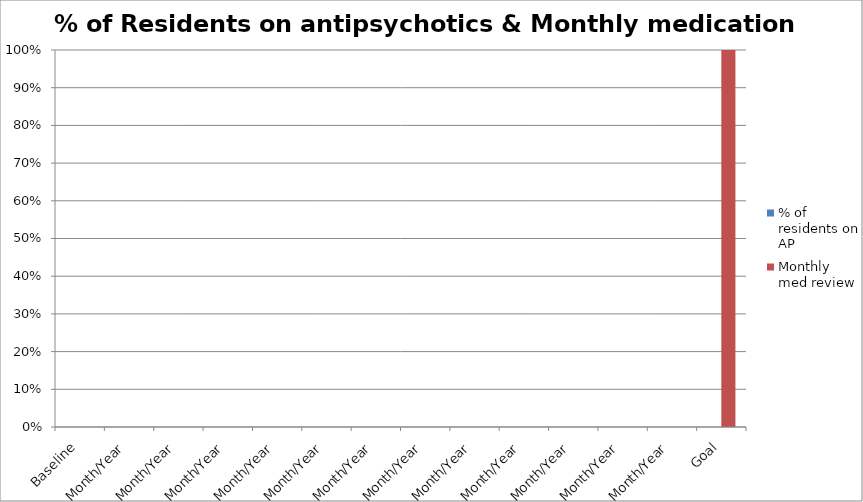
| Category | % of residents on AP | Monthly med review |
|---|---|---|
| Baseline | 0 | 0 |
| Month/Year | 0 | 0 |
| Month/Year | 0 | 0 |
| Month/Year | 0 | 0 |
| Month/Year | 0 | 0 |
| Month/Year | 0 | 0 |
| Month/Year | 0 | 0 |
| Month/Year | 0 | 0 |
| Month/Year | 0 | 0 |
| Month/Year | 0 | 0 |
| Month/Year | 0 | 0 |
| Month/Year | 0 | 0 |
| Month/Year | 0 | 0 |
| Goal | 0 | 1 |